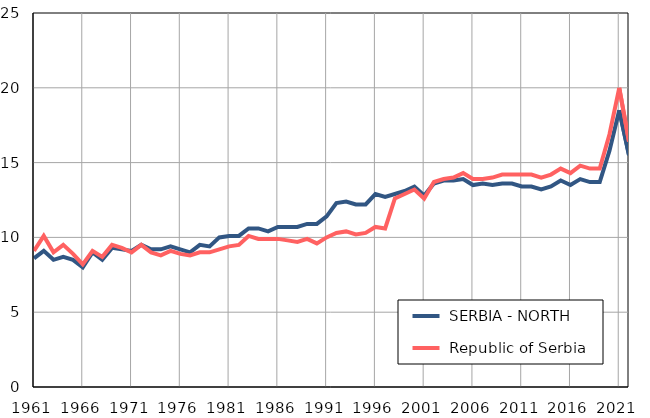
| Category |  SERBIA - NORTH |  Republic of Serbia |
|---|---|---|
| 1961.0 | 8.6 | 9.1 |
| 1962.0 | 9.1 | 10.1 |
| 1963.0 | 8.5 | 9 |
| 1964.0 | 8.7 | 9.5 |
| 1965.0 | 8.5 | 8.9 |
| 1966.0 | 8 | 8.2 |
| 1967.0 | 9 | 9.1 |
| 1968.0 | 8.5 | 8.7 |
| 1969.0 | 9.3 | 9.5 |
| 1970.0 | 9.2 | 9.3 |
| 1971.0 | 9.1 | 9 |
| 1972.0 | 9.5 | 9.5 |
| 1973.0 | 9.2 | 9 |
| 1974.0 | 9.2 | 8.8 |
| 1975.0 | 9.4 | 9.1 |
| 1976.0 | 9.2 | 8.9 |
| 1977.0 | 9 | 8.8 |
| 1978.0 | 9.5 | 9 |
| 1979.0 | 9.4 | 9 |
| 1980.0 | 10 | 9.2 |
| 1981.0 | 10.1 | 9.4 |
| 1982.0 | 10.1 | 9.5 |
| 1983.0 | 10.6 | 10.1 |
| 1984.0 | 10.6 | 9.9 |
| 1985.0 | 10.4 | 9.9 |
| 1986.0 | 10.7 | 9.9 |
| 1987.0 | 10.7 | 9.8 |
| 1988.0 | 10.7 | 9.7 |
| 1989.0 | 10.9 | 9.9 |
| 1990.0 | 10.9 | 9.6 |
| 1991.0 | 11.4 | 10 |
| 1992.0 | 12.3 | 10.3 |
| 1993.0 | 12.4 | 10.4 |
| 1994.0 | 12.2 | 10.2 |
| 1995.0 | 12.2 | 10.3 |
| 1996.0 | 12.9 | 10.7 |
| 1997.0 | 12.7 | 10.6 |
| 1998.0 | 12.9 | 12.6 |
| 1999.0 | 13.1 | 12.9 |
| 2000.0 | 13.4 | 13.2 |
| 2001.0 | 12.8 | 12.6 |
| 2002.0 | 13.6 | 13.7 |
| 2003.0 | 13.8 | 13.9 |
| 2004.0 | 13.8 | 14 |
| 2005.0 | 13.9 | 14.3 |
| 2006.0 | 13.5 | 13.9 |
| 2007.0 | 13.6 | 13.9 |
| 2008.0 | 13.5 | 14 |
| 2009.0 | 13.6 | 14.2 |
| 2010.0 | 13.6 | 14.2 |
| 2011.0 | 13.4 | 14.2 |
| 2012.0 | 13.4 | 14.2 |
| 2013.0 | 13.2 | 14 |
| 2014.0 | 13.4 | 14.2 |
| 2015.0 | 13.8 | 14.6 |
| 2016.0 | 13.5 | 14.3 |
| 2017.0 | 13.9 | 14.8 |
| 2018.0 | 13.7 | 14.6 |
| 2019.0 | 13.7 | 14.6 |
| 2020.0 | 15.8 | 16.9 |
| 2021.0 | 18.5 | 20 |
| 2022.0 | 15.5 | 16.4 |